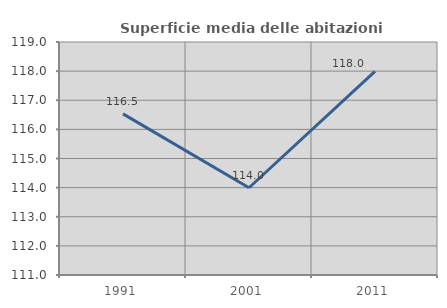
| Category | Superficie media delle abitazioni occupate |
|---|---|
| 1991.0 | 116.531 |
| 2001.0 | 113.996 |
| 2011.0 | 117.993 |